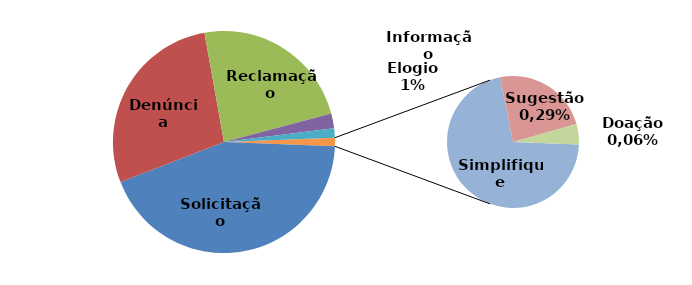
| Category | Series 0 |
|---|---|
| Solicitação | 2827 |
| Denúncia | 1824 |
| Reclamação | 1539 |
| Informação | 140 |
| Elogio | 89 |
| Simplifique | 57 |
| Sugestão | 19 |
| Doação | 4 |